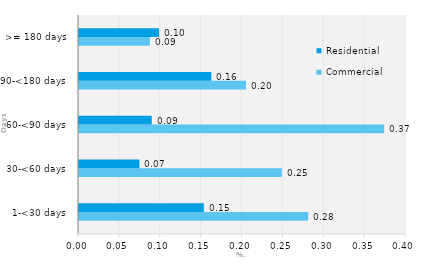
| Category | Commercial | Residential |
|---|---|---|
| 1-<30 days | 0.28 | 0.153 |
| 30-<60 days | 0.248 | 0.074 |
| 60-<90 days | 0.373 | 0.089 |
| 90-<180 days | 0.204 | 0.162 |
| >= 180 days | 0.087 | 0.098 |